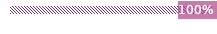
| Category | Series 0 |
|---|---|
| Progresso: | 1 |